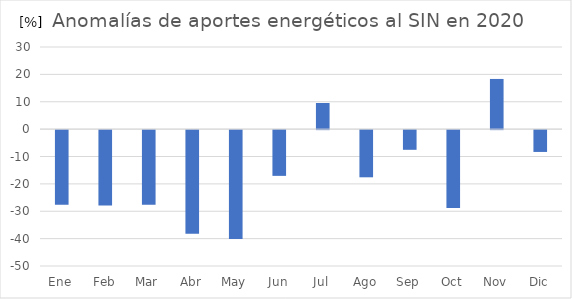
| Category | Series 0 |
|---|---|
| Ene | -27.25 |
| Feb | -27.49 |
| Mar | -27.27 |
| Abr | -37.82 |
| May | -39.79 |
| Jun | -16.71 |
| Jul | 9.54 |
| Ago | -17.23 |
| Sep | -7.19 |
| Oct | -28.48 |
| Nov | 18.33 |
| Dic | -7.97 |